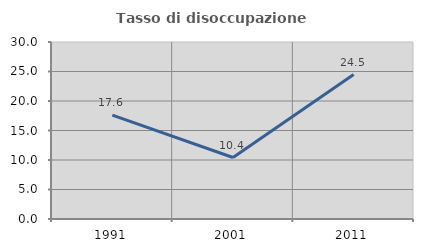
| Category | Tasso di disoccupazione giovanile  |
|---|---|
| 1991.0 | 17.609 |
| 2001.0 | 10.42 |
| 2011.0 | 24.485 |